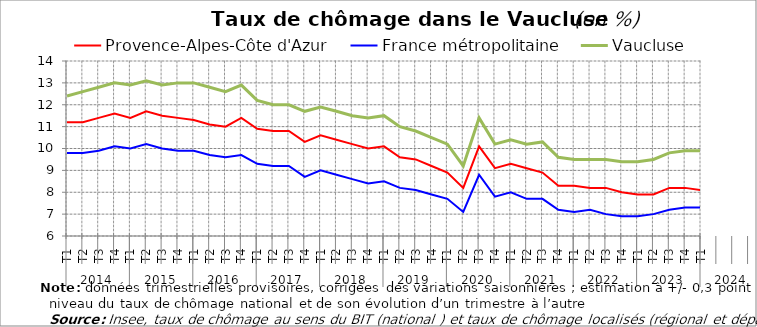
| Category | Provence-Alpes-Côte d'Azur | France métropolitaine | Vaucluse |
|---|---|---|---|
| 0 | 11.2 | 9.8 | 12.4 |
| 1 | 11.2 | 9.8 | 12.6 |
| 2 | 11.4 | 9.9 | 12.8 |
| 3 | 11.6 | 10.1 | 13 |
| 4 | 11.4 | 10 | 12.9 |
| 5 | 11.7 | 10.2 | 13.1 |
| 6 | 11.5 | 10 | 12.9 |
| 7 | 11.4 | 9.9 | 13 |
| 8 | 11.3 | 9.9 | 13 |
| 9 | 11.1 | 9.7 | 12.8 |
| 10 | 11 | 9.6 | 12.6 |
| 11 | 11.4 | 9.7 | 12.9 |
| 12 | 10.9 | 9.3 | 12.2 |
| 13 | 10.8 | 9.2 | 12 |
| 14 | 10.8 | 9.2 | 12 |
| 15 | 10.3 | 8.7 | 11.7 |
| 16 | 10.6 | 9 | 11.9 |
| 17 | 10.4 | 8.8 | 11.7 |
| 18 | 10.2 | 8.6 | 11.5 |
| 19 | 10 | 8.4 | 11.4 |
| 20 | 10.1 | 8.5 | 11.5 |
| 21 | 9.6 | 8.2 | 11 |
| 22 | 9.5 | 8.1 | 10.8 |
| 23 | 9.2 | 7.9 | 10.5 |
| 24 | 8.9 | 7.7 | 10.2 |
| 25 | 8.2 | 7.1 | 9.2 |
| 26 | 10.1 | 8.8 | 11.4 |
| 27 | 9.1 | 7.8 | 10.2 |
| 28 | 9.3 | 8 | 10.4 |
| 29 | 9.1 | 7.7 | 10.2 |
| 30 | 8.9 | 7.7 | 10.3 |
| 31 | 8.3 | 7.2 | 9.6 |
| 32 | 8.3 | 7.1 | 9.5 |
| 33 | 8.2 | 7.2 | 9.5 |
| 34 | 8.2 | 7 | 9.5 |
| 35 | 8 | 6.9 | 9.4 |
| 36 | 7.9 | 6.9 | 9.4 |
| 37 | 7.9 | 7 | 9.5 |
| 38 | 8.2 | 7.2 | 9.8 |
| 39 | 8.2 | 7.3 | 9.9 |
| 40 | 8.1 | 7.3 | 9.9 |